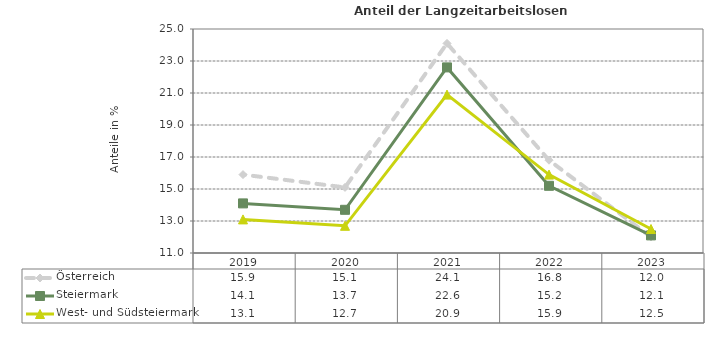
| Category | Österreich | Steiermark | West- und Südsteiermark |
|---|---|---|---|
| 2023.0 | 12 | 12.1 | 12.5 |
| 2022.0 | 16.8 | 15.2 | 15.9 |
| 2021.0 | 24.1 | 22.6 | 20.9 |
| 2020.0 | 15.1 | 13.7 | 12.7 |
| 2019.0 | 15.9 | 14.1 | 13.1 |